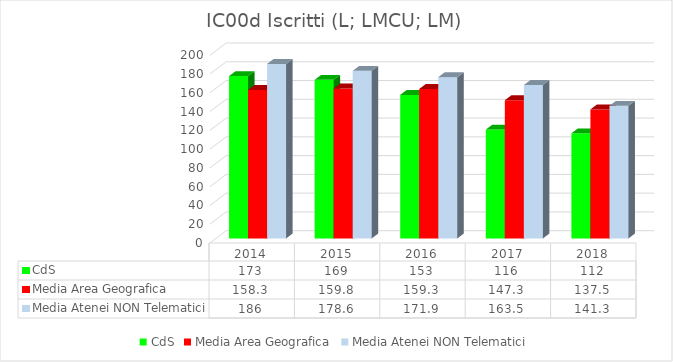
| Category | CdS | Media Area Geografica | Media Atenei NON Telematici |
|---|---|---|---|
| 2014.0 | 173 | 158.3 | 186 |
| 2015.0 | 169 | 159.8 | 178.6 |
| 2016.0 | 153 | 159.3 | 171.9 |
| 2017.0 | 116 | 147.3 | 163.5 |
| 2018.0 | 112 | 137.5 | 141.3 |